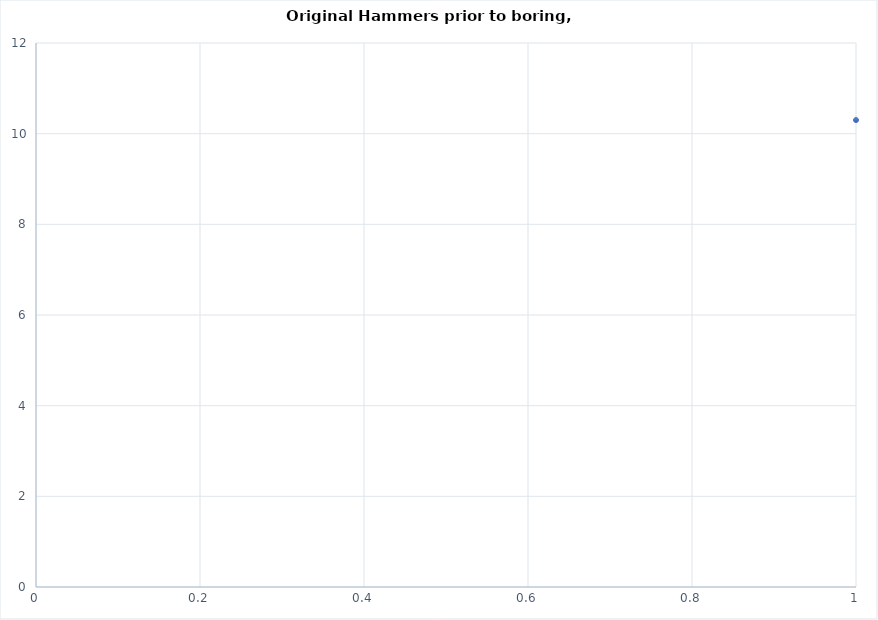
| Category | OAL Shortened |
|---|---|
| 0 | 10.3 |
| 1 | 10.3 |
| 2 | 10.3 |
| 3 | 10.2 |
| 4 | 10.4 |
| 5 | 10.3 |
| 6 | 10.3 |
| 7 | 10.2 |
| 8 | 10 |
| 9 | 10 |
| 10 | 9.6 |
| 11 | 9.5 |
| 12 | 9.5 |
| 13 | 9.4 |
| 14 | 9.7 |
| 15 | 10.6 |
| 16 | 10.5 |
| 17 | 10.5 |
| 18 | 10.5 |
| 19 | 10.5 |
| 20 | 10.5 |
| 21 | 10.3 |
| 22 | 10.1 |
| 23 | 10.2 |
| 24 | 9.4 |
| 25 | 9.5 |
| 26 | 8.9 |
| 27 | 8.7 |
| 28 | 8.6 |
| 29 | 8.6 |
| 30 | 8.6 |
| 31 | 8 |
| 32 | 8.1 |
| 33 | 8 |
| 34 | 8 |
| 35 | 8 |
| 36 | 7.9 |
| 37 | 7.8 |
| 38 | 8 |
| 39 | 8.1 |
| 40 | 7.9 |
| 41 | 8 |
| 42 | 7.8 |
| 43 | 7.7 |
| 44 | 7.7 |
| 45 | 7.7 |
| 46 | 7.5 |
| 47 | 7.5 |
| 48 | 7.5 |
| 49 | 7.5 |
| 50 | 7.2 |
| 51 | 7 |
| 52 | 7.4 |
| 53 | 7.2 |
| 54 | 7.3 |
| 55 | 7.3 |
| 56 | 7.2 |
| 57 | 7.1 |
| 58 | 7 |
| 59 | 6.9 |
| 60 | 6.7 |
| 61 | 6.4 |
| 62 | 6.6 |
| 63 | 6.2 |
| 64 | 6.1 |
| 65 | 6.1 |
| 66 | 5.9 |
| 67 | 5.8 |
| 68 | 5.8 |
| 69 | 5.6 |
| 70 | 5.5 |
| 71 | 5.6 |
| 72 | 5.6 |
| 73 | 5.5 |
| 74 | 5.5 |
| 75 | 5.4 |
| 76 | 5.7 |
| 77 | 5.4 |
| 78 | 5.5 |
| 79 | 5.8 |
| 80 | 5.8 |
| 81 | 5.6 |
| 82 | 5.4 |
| 83 | 5.6 |
| 84 | 5.4 |
| 85 | 5.2 |
| 86 | 5.3 |
| 87 | 5.3 |